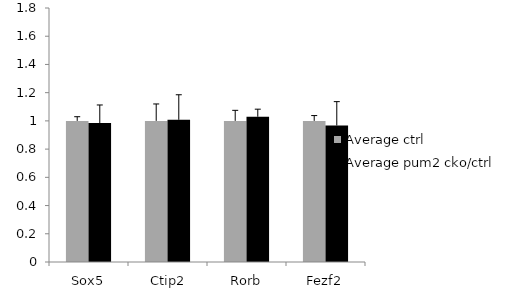
| Category | Average ctrl | Average pum2 cko/ctrl |
|---|---|---|
|  Sox5 | 1 | 0.985 |
|  Ctip2 | 1 | 1.008 |
|  Rorb | 1 | 1.029 |
| Fezf2 | 1 | 0.967 |